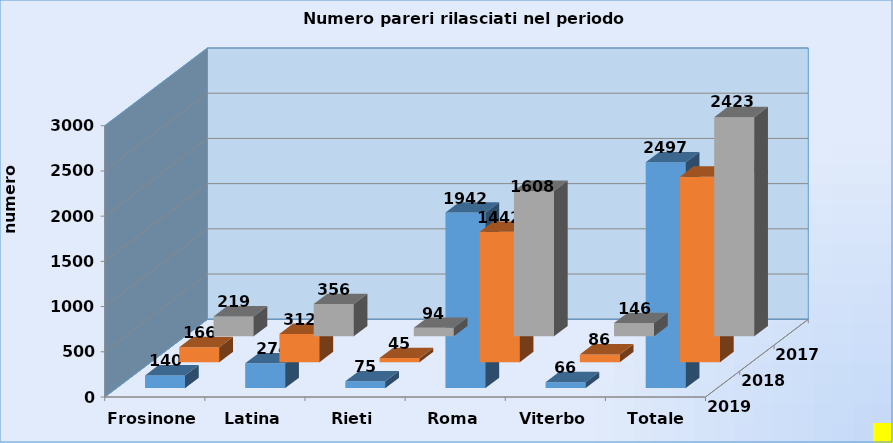
| Category | 2019 | 2018 | 2017 |
|---|---|---|---|
| Frosinone | 219 | 166 | 140 |
| Latina | 356 | 312 | 274 |
| Rieti | 94 | 45 | 75 |
| Roma | 1608 | 1442 | 1942 |
| Viterbo | 146 | 86 | 66 |
| Totale Lazio | 2423 | 2051 | 2497 |